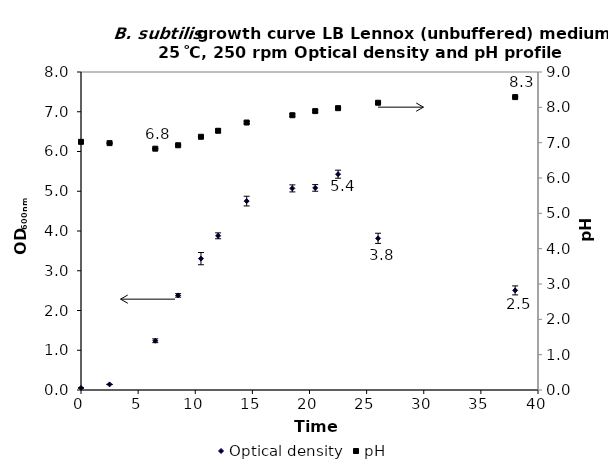
| Category | Optical density |
|---|---|
| 0.0 | 0.051 |
| 2.5 | 0.141 |
| 6.5 | 1.239 |
| 8.5 | 2.38 |
| 10.5 | 3.305 |
| 12.0 | 3.879 |
| 14.5 | 4.752 |
| 18.5 | 5.072 |
| 20.5 | 5.084 |
| 22.5 | 5.429 |
| 26.0 | 3.816 |
| 38.0 | 2.506 |